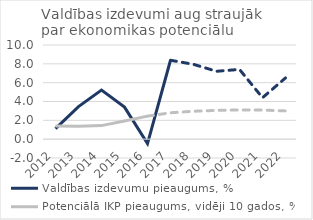
| Category | Valdības izdevumu pieaugums, % | Potenciālā IKP pieaugums, vidēji 10 gados, % |
|---|---|---|
| 2012 | 1.127 | 1.41 |
| 2013 | 3.456 | 1.359 |
| 2014 | 5.221 | 1.439 |
| 2015 | 3.403 | 1.938 |
| 2016 | -0.463 | 2.446 |
| 2017 | 8.379 | 2.802 |
| 2018 | 7.948 | 2.966 |
| 2019 | 7.208 | 3.055 |
| 2020 | 7.407 | 3.1 |
| 2021 | 4.403 | 3.091 |
| 2022 | 6.503 | 3 |